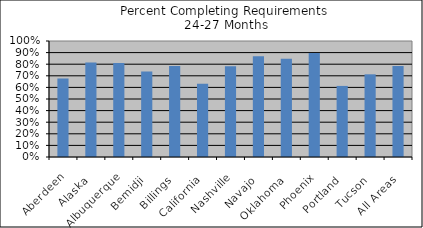
| Category | % Comp. Req. |
|---|---|
| Aberdeen | 0.677 |
| Alaska | 0.814 |
| Albuquerque | 0.811 |
| Bemidji | 0.737 |
| Billings | 0.785 |
| California | 0.633 |
| Nashville | 0.783 |
| Navajo | 0.87 |
| Oklahoma | 0.847 |
| Phoenix | 0.896 |
| Portland | 0.613 |
| Tucson | 0.713 |
| All Areas | 0.784 |